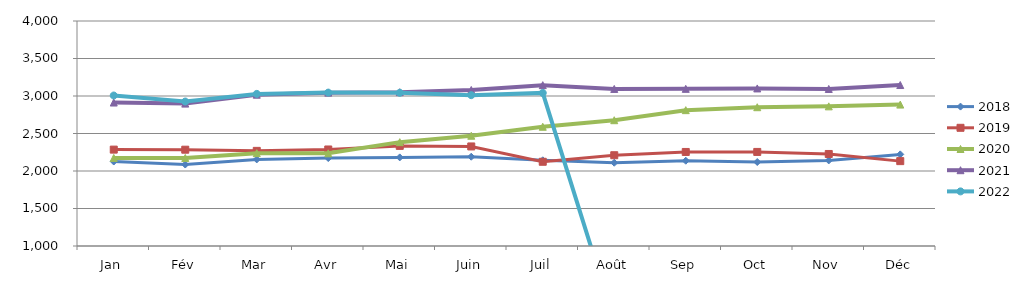
| Category | 2018 | 2019 | 2020 | 2021 | 2022 |
|---|---|---|---|---|---|
| Jan | 2126.43 | 2285.077 | 2174.068 | 2912.819 | 3006.467 |
| Fév | 2086.116 | 2284.041 | 2173.963 | 2898.489 | 2926.234 |
| Mar | 2154.19 | 2268.401 | 2238.064 | 3017.436 | 3028.062 |
| Avr | 2172.692 | 2286.951 | 2235.688 | 3044.815 | 3045.267 |
| Mai | 2181.426 | 2334.869 | 2384.721 | 3050.874 | 3043.095 |
| Juin | 2190.216 | 2327.493 | 2470.094 | 3080.307 | 3011.165 |
| Juil | 2142.84 | 2123.041 | 2589.895 | 3144.694 | 3041.115 |
| Août | 2110.076 | 2210.394 | 2677.173 | 3094.04 | 0 |
| Sep | 2137.072 | 2253.916 | 2811.251 | 3095.309 | 0 |
| Oct | 2119.873 | 2254.192 | 2850.494 | 3100.983 | 0 |
| Nov | 2140.872 | 2226.879 | 2862.02 | 3093.674 | 0 |
| Déc | 2221.568 | 2131.58 | 2885.572 | 3146.391 | 0 |